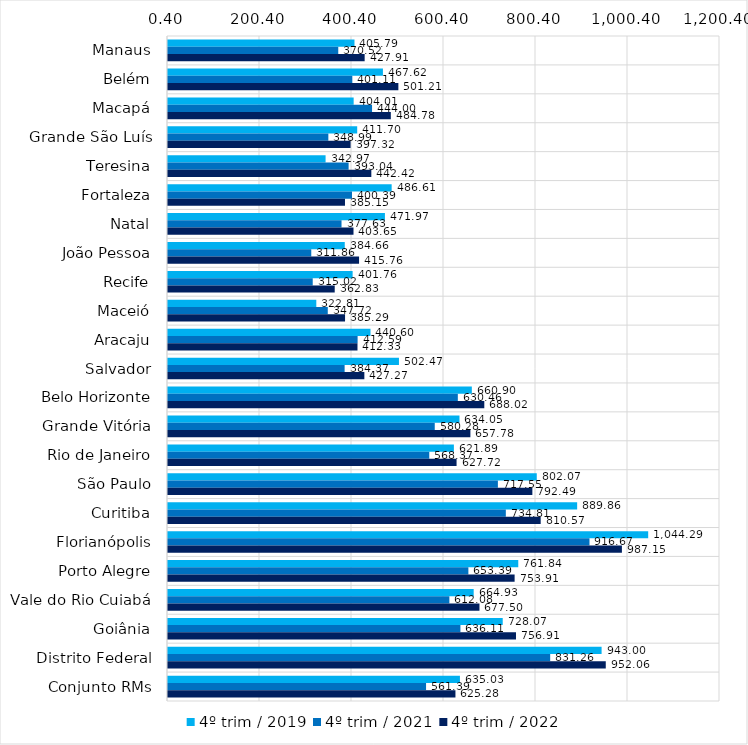
| Category | 4º trim / 2019 | 4º trim / 2021 | 4º trim / 2022 |
|---|---|---|---|
| Manaus | 405.794 | 370.519 | 427.911 |
| Belém | 467.619 | 401.111 | 501.212 |
| Macapá | 404.012 | 444.004 | 484.775 |
| Grande São Luís | 411.701 | 348.99 | 397.322 |
| Teresina | 342.968 | 393.044 | 442.42 |
| Fortaleza | 486.606 | 400.385 | 385.149 |
| Natal | 471.97 | 377.628 | 403.653 |
| João Pessoa | 384.658 | 311.856 | 415.756 |
| Recife | 401.762 | 315.025 | 362.826 |
| Maceió | 322.805 | 347.72 | 385.289 |
| Aracaju | 440.602 | 412.59 | 412.331 |
| Salvador | 502.474 | 384.374 | 427.265 |
| Belo Horizonte | 660.903 | 630.46 | 688.016 |
| Grande Vitória | 634.054 | 580.283 | 657.781 |
| Rio de Janeiro | 621.892 | 568.365 | 627.719 |
| São Paulo | 802.068 | 717.546 | 792.491 |
| Curitiba | 889.863 | 734.813 | 810.574 |
| Florianópolis | 1044.289 | 916.675 | 987.147 |
| Porto Alegre | 761.844 | 653.393 | 753.911 |
| Vale do Rio Cuiabá | 664.932 | 612.077 | 677.502 |
| Goiânia | 728.068 | 636.112 | 756.906 |
| Distrito Federal | 942.996 | 831.262 | 952.065 |
| Conjunto RMs | 635.026 | 561.387 | 625.276 |